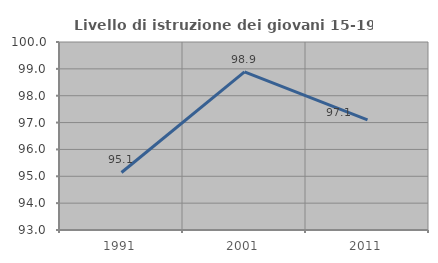
| Category | Livello di istruzione dei giovani 15-19 anni |
|---|---|
| 1991.0 | 95.142 |
| 2001.0 | 98.887 |
| 2011.0 | 97.099 |